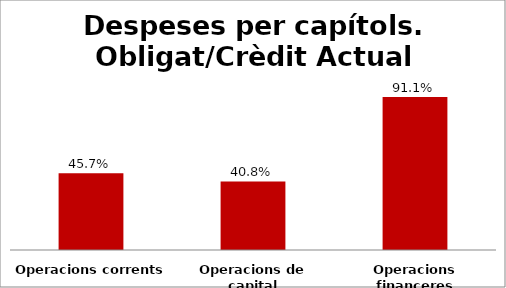
| Category | Series 0 |
|---|---|
| Operacions corrents | 0.457 |
| Operacions de capital | 0.408 |
| Operacions financeres | 0.911 |